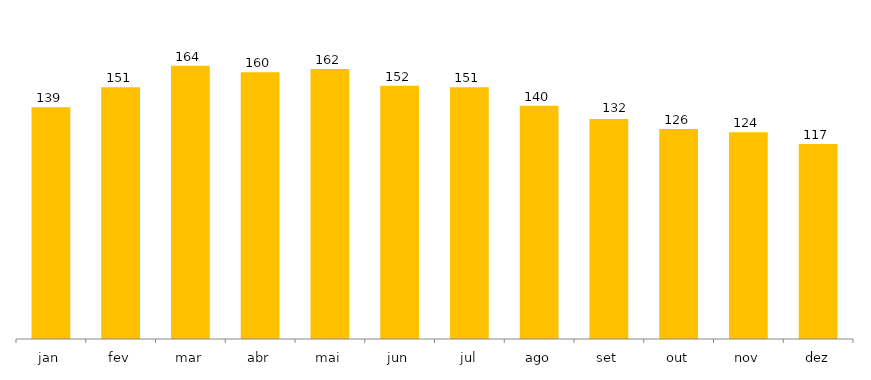
| Category | 2019 |
|---|---|
| jan | 139 |
| fev | 151 |
| mar | 164 |
| abr | 160 |
| mai | 162 |
| jun | 152 |
| jul | 151 |
| ago | 140 |
| set | 132 |
| out | 126 |
| nov | 124 |
| dez | 117 |